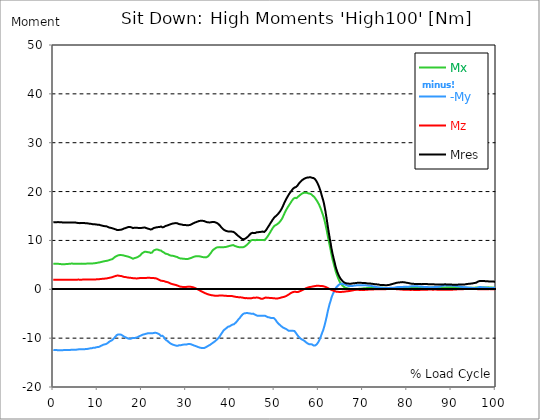
| Category |  Mx |  -My |  Mz |  Mres |
|---|---|---|---|---|
| 0.0 | 5.252 | -12.403 | 1.958 | 13.716 |
| 0.167348456675344 | 5.252 | -12.426 | 1.958 | 13.728 |
| 0.334696913350688 | 5.24 | -12.426 | 1.958 | 13.728 |
| 0.5020453700260321 | 5.228 | -12.438 | 1.958 | 13.728 |
| 0.669393826701376 | 5.228 | -12.426 | 1.958 | 13.716 |
| 0.83674228337672 | 5.228 | -12.438 | 1.958 | 13.728 |
| 1.0040907400520642 | 5.217 | -12.474 | 1.958 | 13.752 |
| 1.1621420602454444 | 5.193 | -12.474 | 1.958 | 13.752 |
| 1.3294905169207885 | 5.193 | -12.474 | 1.958 | 13.74 |
| 1.4968389735961325 | 5.181 | -12.474 | 1.958 | 13.74 |
| 1.6641874302714765 | 5.157 | -12.474 | 1.958 | 13.728 |
| 1.8315358869468206 | 5.121 | -12.474 | 1.958 | 13.716 |
| 1.9988843436221646 | 5.109 | -12.462 | 1.97 | 13.692 |
| 2.1662328002975086 | 5.109 | -12.45 | 1.97 | 13.68 |
| 2.333581256972853 | 5.133 | -12.45 | 1.97 | 13.68 |
| 2.5009297136481967 | 5.145 | -12.438 | 1.958 | 13.68 |
| 2.6682781703235405 | 5.145 | -12.426 | 1.958 | 13.668 |
| 2.8356266269988843 | 5.157 | -12.426 | 1.946 | 13.68 |
| 3.002975083674229 | 5.169 | -12.45 | 1.946 | 13.692 |
| 3.1703235403495724 | 5.193 | -12.438 | 1.946 | 13.692 |
| 3.337671997024917 | 5.193 | -12.426 | 1.958 | 13.692 |
| 3.4957233172182973 | 5.217 | -12.426 | 1.958 | 13.692 |
| 3.663071773893641 | 5.228 | -12.426 | 1.958 | 13.692 |
| 3.8304202305689854 | 5.24 | -12.415 | 1.958 | 13.68 |
| 3.997768687244329 | 5.252 | -12.391 | 1.97 | 13.68 |
| 4.165117143919673 | 5.264 | -12.379 | 1.97 | 13.668 |
| 4.332465600595017 | 5.252 | -12.367 | 1.97 | 13.656 |
| 4.499814057270361 | 5.252 | -12.367 | 1.97 | 13.644 |
| 4.667162513945706 | 5.24 | -12.379 | 1.97 | 13.656 |
| 4.834510970621049 | 5.24 | -12.379 | 1.97 | 13.656 |
| 5.001859427296393 | 5.228 | -12.379 | 1.97 | 13.656 |
| 5.169207883971737 | 5.217 | -12.379 | 1.97 | 13.644 |
| 5.336556340647081 | 5.217 | -12.343 | 1.97 | 13.608 |
| 5.503904797322425 | 5.205 | -12.307 | 1.982 | 13.584 |
| 5.671253253997769 | 5.205 | -12.295 | 1.982 | 13.561 |
| 5.82930457419115 | 5.205 | -12.283 | 1.97 | 13.549 |
| 5.996653030866494 | 5.205 | -12.271 | 1.97 | 13.537 |
| 6.164001487541838 | 5.24 | -12.271 | 1.97 | 13.549 |
| 6.331349944217181 | 5.252 | -12.283 | 1.97 | 13.572 |
| 6.498698400892526 | 5.252 | -12.295 | 1.982 | 13.584 |
| 6.66604685756787 | 5.24 | -12.283 | 1.982 | 13.561 |
| 6.833395314243213 | 5.24 | -12.271 | 1.982 | 13.549 |
| 7.000743770918558 | 5.24 | -12.283 | 1.982 | 13.561 |
| 7.168092227593902 | 5.228 | -12.259 | 1.982 | 13.537 |
| 7.335440684269246 | 5.24 | -12.212 | 1.982 | 13.501 |
| 7.50278914094459 | 5.252 | -12.2 | 1.982 | 13.489 |
| 7.6701375976199335 | 5.264 | -12.212 | 1.982 | 13.501 |
| 7.837486054295278 | 5.264 | -12.2 | 1.982 | 13.489 |
| 7.995537374488658 | 5.264 | -12.152 | 1.982 | 13.453 |
| 8.162885831164003 | 5.276 | -12.104 | 1.982 | 13.417 |
| 8.330234287839346 | 5.276 | -12.092 | 1.982 | 13.405 |
| 8.49758274451469 | 5.288 | -12.104 | 1.97 | 13.417 |
| 8.664931201190035 | 5.288 | -12.068 | 1.982 | 13.381 |
| 8.832279657865378 | 5.288 | -12.009 | 1.993 | 13.334 |
| 8.999628114540721 | 5.3 | -11.973 | 2.005 | 13.298 |
| 9.166976571216066 | 5.324 | -11.985 | 1.993 | 13.322 |
| 9.334325027891412 | 5.336 | -11.985 | 1.993 | 13.322 |
| 9.501673484566755 | 5.348 | -11.937 | 2.005 | 13.286 |
| 9.669021941242098 | 5.372 | -11.877 | 2.029 | 13.25 |
| 9.836370397917442 | 5.407 | -11.842 | 2.041 | 13.226 |
| 10.003718854592787 | 5.443 | -11.818 | 2.041 | 13.226 |
| 10.17106731126813 | 5.467 | -11.806 | 2.053 | 13.226 |
| 10.329118631461512 | 5.479 | -11.782 | 2.065 | 13.214 |
| 10.496467088136853 | 5.515 | -11.698 | 2.089 | 13.155 |
| 10.663815544812199 | 5.551 | -11.615 | 2.101 | 13.107 |
| 10.831164001487544 | 5.598 | -11.555 | 2.113 | 13.083 |
| 10.998512458162887 | 5.634 | -11.483 | 2.137 | 13.035 |
| 11.16586091483823 | 5.67 | -11.412 | 2.149 | 12.999 |
| 11.333209371513574 | 5.706 | -11.328 | 2.173 | 12.952 |
| 11.50055782818892 | 5.73 | -11.316 | 2.173 | 12.94 |
| 11.667906284864264 | 5.766 | -11.257 | 2.184 | 12.916 |
| 11.835254741539607 | 5.801 | -11.233 | 2.184 | 12.916 |
| 12.00260319821495 | 5.813 | -11.173 | 2.22 | 12.892 |
| 12.169951654890292 | 5.837 | -11.09 | 2.244 | 12.82 |
| 12.337300111565641 | 5.885 | -10.97 | 2.28 | 12.749 |
| 12.504648568240984 | 5.945 | -10.827 | 2.316 | 12.689 |
| 12.662699888434362 | 5.992 | -10.696 | 2.352 | 12.629 |
| 12.830048345109708 | 6.028 | -10.612 | 2.375 | 12.582 |
| 12.997396801785053 | 6.088 | -10.552 | 2.411 | 12.57 |
| 13.164745258460396 | 6.136 | -10.481 | 2.435 | 12.534 |
| 13.33209371513574 | 6.171 | -10.385 | 2.483 | 12.486 |
| 13.499442171811083 | 6.255 | -10.242 | 2.543 | 12.438 |
| 13.666790628486426 | 6.41 | -10.063 | 2.602 | 12.379 |
| 13.834139085161771 | 6.565 | -9.896 | 2.65 | 12.343 |
| 14.001487541837117 | 6.673 | -9.729 | 2.698 | 12.295 |
| 14.16883599851246 | 6.756 | -9.538 | 2.746 | 12.212 |
| 14.336184455187803 | 6.816 | -9.371 | 2.793 | 12.152 |
| 14.503532911863147 | 6.9 | -9.251 | 2.793 | 12.128 |
| 14.670881368538492 | 6.947 | -9.239 | 2.805 | 12.14 |
| 14.828932688731873 | 6.983 | -9.227 | 2.805 | 12.152 |
| 14.996281145407215 | 7.007 | -9.251 | 2.746 | 12.164 |
| 15.163629602082558 | 7.019 | -9.215 | 2.757 | 12.164 |
| 15.330978058757903 | 6.995 | -9.299 | 2.722 | 12.2 |
| 15.498326515433247 | 6.995 | -9.371 | 2.674 | 12.236 |
| 15.665674972108594 | 6.983 | -9.49 | 2.614 | 12.307 |
| 15.833023428783937 | 6.924 | -9.621 | 2.543 | 12.403 |
| 16.00037188545928 | 6.888 | -9.693 | 2.531 | 12.45 |
| 16.167720342134626 | 6.876 | -9.753 | 2.531 | 12.498 |
| 16.335068798809967 | 6.816 | -9.836 | 2.495 | 12.534 |
| 16.502417255485312 | 6.78 | -9.872 | 2.471 | 12.582 |
| 16.669765712160658 | 6.733 | -9.979 | 2.435 | 12.653 |
| 16.837114168836 | 6.685 | -10.063 | 2.411 | 12.713 |
| 17.004462625511344 | 6.661 | -10.099 | 2.387 | 12.761 |
| 17.16251394570472 | 6.613 | -10.158 | 2.364 | 12.808 |
| 17.32986240238007 | 6.542 | -10.135 | 2.352 | 12.761 |
| 17.497210859055414 | 6.47 | -10.111 | 2.34 | 12.713 |
| 17.664559315730756 | 6.398 | -10.075 | 2.328 | 12.665 |
| 17.8319077724061 | 6.267 | -9.979 | 2.28 | 12.522 |
| 17.999256229081443 | 6.255 | -9.944 | 2.268 | 12.522 |
| 18.166604685756788 | 6.303 | -9.967 | 2.268 | 12.558 |
| 18.333953142432133 | 6.374 | -9.979 | 2.244 | 12.594 |
| 18.501301599107478 | 6.422 | -9.932 | 2.244 | 12.606 |
| 18.668650055782823 | 6.47 | -9.908 | 2.232 | 12.594 |
| 18.835998512458165 | 6.506 | -9.884 | 2.208 | 12.594 |
| 19.00334696913351 | 6.565 | -9.824 | 2.232 | 12.582 |
| 19.170695425808855 | 6.661 | -9.741 | 2.256 | 12.558 |
| 19.338043882484197 | 6.756 | -9.645 | 2.28 | 12.534 |
| 19.496095202677576 | 6.864 | -9.538 | 2.304 | 12.51 |
| 19.66344365935292 | 6.959 | -9.514 | 2.292 | 12.534 |
| 19.830792116028263 | 7.138 | -9.442 | 2.316 | 12.558 |
| 19.998140572703612 | 7.329 | -9.371 | 2.328 | 12.57 |
| 20.165489029378953 | 7.425 | -9.311 | 2.328 | 12.594 |
| 20.3328374860543 | 7.52 | -9.251 | 2.316 | 12.617 |
| 20.500185942729644 | 7.628 | -9.203 | 2.328 | 12.641 |
| 20.667534399404985 | 7.676 | -9.18 | 2.328 | 12.641 |
| 20.83488285608033 | 7.687 | -9.144 | 2.34 | 12.594 |
| 21.002231312755672 | 7.664 | -9.096 | 2.328 | 12.534 |
| 21.16957976943102 | 7.64 | -9.036 | 2.34 | 12.474 |
| 21.336928226106362 | 7.604 | -9.012 | 2.352 | 12.426 |
| 21.504276682781704 | 7.592 | -9.001 | 2.352 | 12.403 |
| 21.67162513945705 | 7.568 | -8.989 | 2.352 | 12.343 |
| 21.82967645965043 | 7.496 | -8.989 | 2.34 | 12.283 |
| 21.997024916325774 | 7.437 | -8.977 | 2.328 | 12.236 |
| 22.16437337300112 | 7.425 | -8.977 | 2.328 | 12.224 |
| 22.33172182967646 | 7.532 | -9.012 | 2.304 | 12.307 |
| 22.499070286351806 | 7.711 | -9.001 | 2.292 | 12.415 |
| 22.666418743027148 | 7.926 | -8.953 | 2.292 | 12.534 |
| 22.833767199702496 | 8.01 | -8.905 | 2.304 | 12.57 |
| 23.00111565637784 | 8.069 | -8.893 | 2.268 | 12.606 |
| 23.168464113053183 | 8.117 | -8.917 | 2.232 | 12.641 |
| 23.335812569728528 | 8.153 | -8.941 | 2.196 | 12.677 |
| 23.50316102640387 | 8.153 | -8.989 | 2.137 | 12.713 |
| 23.670509483079215 | 8.105 | -9.084 | 2.041 | 12.725 |
| 23.83785793975456 | 8.046 | -9.096 | 1.982 | 12.689 |
| 23.995909259947936 | 7.974 | -9.239 | 1.91 | 12.737 |
| 24.163257716623285 | 7.974 | -9.442 | 1.826 | 12.832 |
| 24.330606173298627 | 7.926 | -9.55 | 1.755 | 12.856 |
| 24.49795462997397 | 7.819 | -9.502 | 1.731 | 12.761 |
| 24.665303086649313 | 7.687 | -9.514 | 1.719 | 12.677 |
| 24.83265154332466 | 7.592 | -9.609 | 1.707 | 12.677 |
| 25.0 | 7.532 | -9.8 | 1.683 | 12.761 |
| 25.167348456675345 | 7.401 | -10.111 | 1.6 | 12.88 |
| 25.334696913350694 | 7.294 | -10.29 | 1.552 | 12.952 |
| 25.502045370026035 | 7.27 | -10.421 | 1.516 | 13.011 |
| 25.669393826701377 | 7.234 | -10.481 | 1.492 | 13.035 |
| 25.836742283376722 | 7.186 | -10.588 | 1.444 | 13.083 |
| 26.004090740052067 | 7.126 | -10.719 | 1.397 | 13.143 |
| 26.17143919672741 | 7.031 | -10.875 | 1.325 | 13.202 |
| 26.329490516920792 | 6.947 | -11.018 | 1.241 | 13.262 |
| 26.49683897359613 | 6.912 | -11.101 | 1.17 | 13.322 |
| 26.66418743027148 | 6.888 | -11.185 | 1.122 | 13.37 |
| 26.831535886946828 | 6.864 | -11.257 | 1.086 | 13.417 |
| 26.998884343622166 | 6.852 | -11.328 | 1.039 | 13.465 |
| 27.166232800297514 | 6.828 | -11.376 | 1.003 | 13.501 |
| 27.333581256972852 | 6.78 | -11.424 | 0.955 | 13.501 |
| 27.5009297136482 | 6.721 | -11.472 | 0.919 | 13.525 |
| 27.668278170323543 | 6.685 | -11.519 | 0.883 | 13.549 |
| 27.835626626998888 | 6.661 | -11.543 | 0.848 | 13.549 |
| 28.002975083674233 | 6.601 | -11.543 | 0.788 | 13.525 |
| 28.170323540349575 | 6.518 | -11.543 | 0.728 | 13.477 |
| 28.33767199702492 | 6.422 | -11.472 | 0.657 | 13.37 |
| 28.50502045370026 | 6.362 | -11.436 | 0.597 | 13.31 |
| 28.663071773893645 | 6.327 | -11.436 | 0.549 | 13.298 |
| 28.830420230568986 | 6.327 | -11.436 | 0.525 | 13.298 |
| 28.99776868724433 | 6.303 | -11.412 | 0.513 | 13.262 |
| 29.165117143919673 | 6.267 | -11.364 | 0.477 | 13.202 |
| 29.33246560059502 | 6.243 | -11.328 | 0.466 | 13.167 |
| 29.499814057270367 | 6.231 | -11.316 | 0.454 | 13.155 |
| 29.66716251394571 | 6.231 | -11.304 | 0.454 | 13.143 |
| 29.834510970621054 | 6.207 | -11.304 | 0.466 | 13.143 |
| 30.00185942729639 | 6.183 | -11.292 | 0.477 | 13.131 |
| 30.169207883971744 | 6.183 | -11.281 | 0.489 | 13.131 |
| 30.33655634064708 | 6.195 | -11.245 | 0.513 | 13.131 |
| 30.50390479732243 | 6.243 | -11.209 | 0.537 | 13.119 |
| 30.671253253997772 | 6.279 | -11.185 | 0.549 | 13.131 |
| 30.829304574191156 | 6.327 | -11.197 | 0.537 | 13.167 |
| 30.996653030866494 | 6.374 | -11.209 | 0.525 | 13.202 |
| 31.164001487541842 | 6.434 | -11.269 | 0.501 | 13.274 |
| 31.331349944217187 | 6.482 | -11.328 | 0.466 | 13.346 |
| 31.498698400892525 | 6.553 | -11.388 | 0.43 | 13.441 |
| 31.666046857567874 | 6.625 | -11.46 | 0.382 | 13.525 |
| 31.833395314243212 | 6.697 | -11.519 | 0.334 | 13.608 |
| 32.00074377091856 | 6.721 | -11.567 | 0.263 | 13.656 |
| 32.1680922275939 | 6.756 | -11.615 | 0.191 | 13.716 |
| 32.33544068426925 | 6.768 | -11.674 | 0.119 | 13.763 |
| 32.50278914094459 | 6.744 | -11.734 | 0.036 | 13.823 |
| 32.670137597619934 | 6.756 | -11.794 | -0.036 | 13.883 |
| 32.83748605429528 | 6.756 | -11.854 | -0.119 | 13.943 |
| 33.004834510970625 | 6.756 | -11.913 | -0.191 | 13.99 |
| 33.162885831164004 | 6.721 | -11.949 | -0.275 | 14.002 |
| 33.33023428783935 | 6.685 | -11.973 | -0.346 | 14.014 |
| 33.497582744514695 | 6.649 | -12.009 | -0.43 | 14.026 |
| 33.664931201190036 | 6.613 | -12.021 | -0.501 | 14.014 |
| 33.83227965786538 | 6.589 | -12.021 | -0.585 | 14.002 |
| 33.99962811454073 | 6.553 | -12.021 | -0.657 | 13.99 |
| 34.16697657121607 | 6.53 | -11.997 | -0.728 | 13.954 |
| 34.33432502789141 | 6.53 | -11.913 | -0.8 | 13.871 |
| 34.50167348456676 | 6.53 | -11.842 | -0.859 | 13.799 |
| 34.6690219412421 | 6.577 | -11.758 | -0.931 | 13.752 |
| 34.83637039791744 | 6.649 | -11.674 | -0.991 | 13.728 |
| 35.00371885459279 | 6.756 | -11.591 | -1.039 | 13.704 |
| 35.17106731126814 | 6.924 | -11.495 | -1.086 | 13.68 |
| 35.338415767943474 | 7.114 | -11.4 | -1.122 | 13.68 |
| 35.49646708813686 | 7.317 | -11.328 | -1.158 | 13.716 |
| 35.6638155448122 | 7.508 | -11.209 | -1.194 | 13.716 |
| 35.831164001487544 | 7.735 | -11.101 | -1.218 | 13.752 |
| 35.998512458162885 | 7.95 | -10.994 | -1.241 | 13.787 |
| 36.165860914838234 | 8.117 | -10.887 | -1.265 | 13.811 |
| 36.333209371513576 | 8.213 | -10.791 | -1.289 | 13.775 |
| 36.50055782818892 | 8.272 | -10.672 | -1.301 | 13.716 |
| 36.667906284864266 | 8.416 | -10.54 | -1.325 | 13.692 |
| 36.83525474153961 | 8.523 | -10.409 | -1.325 | 13.644 |
| 37.002603198214956 | 8.571 | -10.266 | -1.325 | 13.561 |
| 37.1699516548903 | 8.619 | -10.123 | -1.325 | 13.477 |
| 37.337300111565646 | 8.619 | -9.956 | -1.301 | 13.346 |
| 37.50464856824098 | 8.619 | -9.776 | -1.277 | 13.202 |
| 37.66269988843437 | 8.631 | -9.562 | -1.265 | 13.047 |
| 37.83004834510971 | 8.607 | -9.311 | -1.265 | 12.844 |
| 37.99739680178505 | 8.595 | -9.072 | -1.265 | 12.653 |
| 38.16474525846039 | 8.619 | -8.857 | -1.265 | 12.498 |
| 38.33209371513574 | 8.619 | -8.631 | -1.289 | 12.343 |
| 38.49944217181109 | 8.607 | -8.416 | -1.301 | 12.188 |
| 38.666790628486424 | 8.631 | -8.296 | -1.313 | 12.116 |
| 38.83413908516178 | 8.654 | -8.153 | -1.325 | 12.033 |
| 39.001487541837115 | 8.666 | -8.022 | -1.337 | 11.961 |
| 39.16883599851246 | 8.678 | -7.926 | -1.349 | 11.913 |
| 39.336184455187805 | 8.738 | -7.783 | -1.361 | 11.877 |
| 39.503532911863154 | 8.798 | -7.652 | -1.373 | 11.842 |
| 39.670881368538495 | 8.833 | -7.556 | -1.373 | 11.818 |
| 39.83822982521384 | 8.905 | -7.592 | -1.373 | 11.901 |
| 39.996281145407224 | 8.917 | -7.508 | -1.373 | 11.854 |
| 40.163629602082565 | 8.953 | -7.401 | -1.361 | 11.818 |
| 40.33097805875791 | 9.001 | -7.317 | -1.373 | 11.806 |
| 40.498326515433256 | 9.036 | -7.234 | -1.397 | 11.794 |
| 40.6656749721086 | 9.048 | -7.174 | -1.444 | 11.758 |
| 40.83302342878393 | 9.001 | -7.15 | -1.48 | 11.71 |
| 41.00037188545929 | 8.893 | -7.091 | -1.504 | 11.591 |
| 41.16772034213463 | 8.821 | -6.888 | -1.552 | 11.424 |
| 41.33506879880997 | 8.774 | -6.744 | -1.564 | 11.304 |
| 41.50241725548531 | 8.726 | -6.577 | -1.576 | 11.173 |
| 41.66976571216066 | 8.678 | -6.374 | -1.6 | 11.018 |
| 41.837114168836 | 8.642 | -6.171 | -1.647 | 10.887 |
| 42.004462625511344 | 8.619 | -6.004 | -1.659 | 10.779 |
| 42.17181108218669 | 8.595 | -5.849 | -1.659 | 10.672 |
| 42.32986240238007 | 8.583 | -5.67 | -1.647 | 10.54 |
| 42.497210859055414 | 8.583 | -5.431 | -1.659 | 10.397 |
| 42.66455931573076 | 8.583 | -5.252 | -1.683 | 10.314 |
| 42.831907772406105 | 8.595 | -5.109 | -1.719 | 10.254 |
| 42.999256229081446 | 8.631 | -5.014 | -1.755 | 10.242 |
| 43.16660468575679 | 8.714 | -4.93 | -1.791 | 10.278 |
| 43.33395314243214 | 8.798 | -4.87 | -1.814 | 10.338 |
| 43.50130159910748 | 8.905 | -4.882 | -1.802 | 10.433 |
| 43.66865005578282 | 9.024 | -4.87 | -1.802 | 10.54 |
| 43.83599851245817 | 9.18 | -4.858 | -1.826 | 10.672 |
| 44.00334696913351 | 9.323 | -4.835 | -1.838 | 10.791 |
| 44.17069542580886 | 9.478 | -4.906 | -1.838 | 10.958 |
| 44.3380438824842 | 9.633 | -4.954 | -1.838 | 11.125 |
| 44.49609520267758 | 9.8 | -4.954 | -1.85 | 11.269 |
| 44.66344365935292 | 9.967 | -5.002 | -1.862 | 11.424 |
| 44.83079211602827 | 10.063 | -5.026 | -1.85 | 11.519 |
| 44.99814057270361 | 10.111 | -5.026 | -1.791 | 11.555 |
| 45.16548902937895 | 10.123 | -4.978 | -1.731 | 11.531 |
| 45.332837486054295 | 10.087 | -5.073 | -1.707 | 11.519 |
| 45.500185942729644 | 10.063 | -5.157 | -1.707 | 11.519 |
| 45.66753439940499 | 10.039 | -5.228 | -1.719 | 11.531 |
| 45.83488285608033 | 10.087 | -5.3 | -1.719 | 11.591 |
| 46.00223131275568 | 10.123 | -5.407 | -1.695 | 11.674 |
| 46.16957976943102 | 10.135 | -5.431 | -1.707 | 11.71 |
| 46.336928226106366 | 10.099 | -5.419 | -1.719 | 11.686 |
| 46.50427668278171 | 10.075 | -5.431 | -1.767 | 11.698 |
| 46.671625139457056 | 10.099 | -5.407 | -1.826 | 11.734 |
| 46.829676459650436 | 10.099 | -5.396 | -1.886 | 11.746 |
| 46.99702491632577 | 10.075 | -5.407 | -1.946 | 11.758 |
| 47.16437337300112 | 10.075 | -5.419 | -1.982 | 11.782 |
| 47.33172182967646 | 10.099 | -5.431 | -1.946 | 11.818 |
| 47.49907028635181 | 10.063 | -5.396 | -1.886 | 11.77 |
| 47.66641874302716 | 10.051 | -5.336 | -1.802 | 11.734 |
| 47.83376719970249 | 10.147 | -5.407 | -1.743 | 11.854 |
| 48.001115656377834 | 10.29 | -5.467 | -1.695 | 11.997 |
| 48.16846411305319 | 10.457 | -5.563 | -1.695 | 12.212 |
| 48.33581256972853 | 10.684 | -5.634 | -1.719 | 12.45 |
| 48.50316102640387 | 10.91 | -5.706 | -1.719 | 12.689 |
| 48.67050948307921 | 11.137 | -5.694 | -1.731 | 12.892 |
| 48.837857939754564 | 11.376 | -5.754 | -1.791 | 13.155 |
| 49.005206396429905 | 11.627 | -5.825 | -1.791 | 13.417 |
| 49.163257716623285 | 11.889 | -5.861 | -1.779 | 13.656 |
| 49.33060617329863 | 12.14 | -5.849 | -1.779 | 13.871 |
| 49.49795462997397 | 12.403 | -5.861 | -1.802 | 14.133 |
| 49.66530308664932 | 12.629 | -5.861 | -1.826 | 14.348 |
| 49.832651543324666 | 12.82 | -5.885 | -1.838 | 14.539 |
| 50.0 | 12.999 | -5.992 | -1.85 | 14.754 |
| 50.16734845667534 | 13.095 | -6.171 | -1.862 | 14.897 |
| 50.33469691335069 | 13.167 | -6.374 | -1.886 | 14.993 |
| 50.50204537002604 | 13.25 | -6.613 | -1.886 | 15.136 |
| 50.66939382670139 | 13.358 | -6.816 | -1.874 | 15.291 |
| 50.836742283376715 | 13.477 | -6.983 | -1.838 | 15.47 |
| 51.00409074005207 | 13.608 | -7.126 | -1.814 | 15.638 |
| 51.17143919672741 | 13.763 | -7.258 | -1.779 | 15.829 |
| 51.32949051692079 | 13.954 | -7.401 | -1.743 | 16.055 |
| 51.496838973596134 | 14.157 | -7.532 | -1.695 | 16.294 |
| 51.66418743027148 | 14.396 | -7.664 | -1.647 | 16.557 |
| 51.831535886946824 | 14.671 | -7.771 | -1.612 | 16.867 |
| 51.99888434362217 | 15.017 | -7.89 | -1.588 | 17.225 |
| 52.16623280029752 | 15.351 | -7.926 | -1.552 | 17.559 |
| 52.33358125697285 | 15.697 | -7.998 | -1.504 | 17.906 |
| 52.5009297136482 | 16.008 | -8.069 | -1.444 | 18.204 |
| 52.668278170323546 | 16.282 | -8.129 | -1.361 | 18.491 |
| 52.835626626998895 | 16.545 | -8.249 | -1.277 | 18.765 |
| 53.00297508367424 | 16.795 | -8.356 | -1.194 | 19.028 |
| 53.17032354034958 | 17.034 | -8.475 | -1.098 | 19.29 |
| 53.33767199702492 | 17.273 | -8.535 | -1.003 | 19.541 |
| 53.50502045370027 | 17.5 | -8.499 | -0.883 | 19.732 |
| 53.663071773893655 | 17.727 | -8.499 | -0.788 | 19.947 |
| 53.83042023056899 | 17.977 | -8.499 | -0.704 | 20.162 |
| 53.99776868724433 | 18.204 | -8.499 | -0.633 | 20.365 |
| 54.16511714391967 | 18.395 | -8.499 | -0.585 | 20.556 |
| 54.33246560059503 | 18.574 | -8.499 | -0.537 | 20.699 |
| 54.49981405727037 | 18.693 | -8.535 | -0.501 | 20.818 |
| 54.667162513945705 | 18.717 | -8.666 | -0.489 | 20.866 |
| 54.834510970621054 | 18.67 | -8.929 | -0.525 | 20.914 |
| 55.0018594272964 | 18.658 | -9.144 | -0.561 | 20.985 |
| 55.169207883971744 | 18.777 | -9.371 | -0.561 | 21.188 |
| 55.336556340647086 | 18.944 | -9.574 | -0.549 | 21.415 |
| 55.50390479732243 | 19.087 | -9.741 | -0.501 | 21.63 |
| 55.671253253997776 | 19.207 | -9.896 | -0.43 | 21.809 |
| 55.83860171067312 | 19.338 | -10.039 | -0.37 | 21.976 |
| 55.9966530308665 | 19.445 | -10.111 | -0.298 | 22.131 |
| 56.16400148754184 | 19.553 | -10.266 | -0.227 | 22.287 |
| 56.33134994421718 | 19.648 | -10.326 | -0.155 | 22.406 |
| 56.498698400892536 | 19.696 | -10.397 | -0.072 | 22.501 |
| 56.66604685756788 | 19.744 | -10.481 | 0.012 | 22.597 |
| 56.83339531424321 | 19.768 | -10.612 | 0.084 | 22.68 |
| 57.00074377091856 | 19.78 | -10.767 | 0.155 | 22.764 |
| 57.16809222759391 | 19.756 | -10.875 | 0.227 | 22.812 |
| 57.33544068426925 | 19.732 | -10.97 | 0.286 | 22.848 |
| 57.5027891409446 | 19.684 | -11.09 | 0.346 | 22.883 |
| 57.670137597619934 | 19.625 | -11.209 | 0.394 | 22.907 |
| 57.83748605429528 | 19.577 | -11.245 | 0.442 | 22.907 |
| 58.004834510970625 | 19.565 | -11.185 | 0.466 | 22.919 |
| 58.16288583116401 | 19.529 | -11.233 | 0.489 | 22.931 |
| 58.330234287839346 | 19.434 | -11.292 | 0.513 | 22.907 |
| 58.497582744514695 | 19.29 | -11.292 | 0.549 | 22.812 |
| 58.66493120119004 | 19.147 | -11.436 | 0.573 | 22.8 |
| 58.832279657865385 | 19.004 | -11.519 | 0.597 | 22.764 |
| 58.999628114540734 | 18.873 | -11.555 | 0.633 | 22.692 |
| 59.16697657121607 | 18.682 | -11.507 | 0.657 | 22.537 |
| 59.33432502789142 | 18.467 | -11.424 | 0.692 | 22.334 |
| 59.50167348456676 | 18.24 | -11.316 | 0.716 | 22.096 |
| 59.66902194124211 | 18.001 | -11.137 | 0.716 | 21.833 |
| 59.83637039791745 | 17.738 | -10.91 | 0.716 | 21.511 |
| 60.00371885459278 | 17.452 | -10.648 | 0.704 | 21.152 |
| 60.17106731126813 | 17.142 | -10.349 | 0.692 | 20.759 |
| 60.33841576794349 | 16.784 | -9.991 | 0.692 | 20.317 |
| 60.49646708813685 | 16.402 | -9.597 | 0.68 | 19.804 |
| 60.6638155448122 | 15.972 | -9.168 | 0.668 | 19.255 |
| 60.831164001487544 | 15.53 | -8.75 | 0.657 | 18.717 |
| 60.99851245816289 | 15.112 | -8.392 | 0.633 | 18.252 |
| 61.16586091483824 | 14.587 | -7.89 | 0.597 | 17.607 |
| 61.333209371513576 | 13.99 | -7.341 | 0.549 | 16.867 |
| 61.50055782818892 | 13.358 | -6.756 | 0.501 | 16.055 |
| 61.667906284864266 | 12.665 | -6.1 | 0.442 | 15.124 |
| 61.835254741539615 | 11.937 | -5.443 | 0.37 | 14.181 |
| 62.002603198214956 | 11.149 | -4.715 | 0.286 | 13.167 |
| 62.16995165489029 | 10.385 | -4.059 | 0.203 | 12.2 |
| 62.33730011156564 | 9.621 | -3.45 | 0.119 | 11.281 |
| 62.504648568240995 | 8.881 | -2.889 | 0.036 | 10.397 |
| 62.67199702491633 | 8.177 | -2.435 | -0.036 | 9.609 |
| 62.83004834510971 | 7.341 | -1.85 | -0.107 | 8.619 |
| 62.99739680178505 | 6.637 | -1.409 | -0.167 | 7.819 |
| 63.1647452584604 | 6.004 | -1.039 | -0.227 | 7.114 |
| 63.33209371513575 | 5.419 | -0.74 | -0.286 | 6.482 |
| 63.4994421718111 | 4.835 | -0.394 | -0.346 | 5.837 |
| 63.666790628486424 | 4.273 | -0.119 | -0.394 | 5.228 |
| 63.83413908516177 | 3.689 | 0.191 | -0.442 | 4.596 |
| 64.00148754183712 | 3.223 | 0.43 | -0.489 | 4.094 |
| 64.16883599851248 | 2.805 | 0.597 | -0.513 | 3.653 |
| 64.3361844551878 | 2.399 | 0.728 | -0.525 | 3.235 |
| 64.50353291186315 | 2.053 | 0.848 | -0.537 | 2.901 |
| 64.6708813685385 | 1.695 | 1.015 | -0.537 | 2.59 |
| 64.83822982521384 | 1.421 | 1.05 | -0.549 | 2.328 |
| 65.00557828188919 | 1.17 | 1.11 | -0.537 | 2.101 |
| 65.16362960208257 | 0.967 | 1.122 | -0.537 | 1.898 |
| 65.3309780587579 | 0.788 | 1.122 | -0.525 | 1.719 |
| 65.49832651543326 | 0.645 | 1.074 | -0.513 | 1.576 |
| 65.6656749721086 | 0.513 | 1.027 | -0.501 | 1.456 |
| 65.83302342878395 | 0.406 | 0.991 | -0.477 | 1.361 |
| 66.00037188545929 | 0.322 | 0.943 | -0.454 | 1.289 |
| 66.16772034213463 | 0.275 | 0.883 | -0.442 | 1.241 |
| 66.33506879880998 | 0.227 | 0.812 | -0.418 | 1.194 |
| 66.50241725548531 | 0.191 | 0.74 | -0.406 | 1.194 |
| 66.66976571216065 | 0.155 | 0.692 | -0.382 | 1.17 |
| 66.83711416883601 | 0.119 | 0.668 | -0.358 | 1.158 |
| 67.00446262551135 | 0.095 | 0.645 | -0.346 | 1.134 |
| 67.1718110821867 | 0.048 | 0.657 | -0.31 | 1.146 |
| 67.32986240238007 | 0.024 | 0.668 | -0.286 | 1.146 |
| 67.49721085905541 | 0.012 | 0.692 | -0.251 | 1.17 |
| 67.66455931573076 | 0.012 | 0.68 | -0.227 | 1.206 |
| 67.83190777240611 | 0.024 | 0.692 | -0.203 | 1.218 |
| 67.99925622908145 | 0.012 | 0.752 | -0.167 | 1.241 |
| 68.16660468575678 | 0 | 0.764 | -0.143 | 1.253 |
| 68.33395314243214 | 0 | 0.788 | -0.119 | 1.265 |
| 68.50130159910749 | 0.024 | 0.824 | -0.107 | 1.289 |
| 68.66865005578282 | 0.036 | 0.824 | -0.095 | 1.313 |
| 68.83599851245816 | 0.06 | 0.812 | -0.107 | 1.337 |
| 69.00334696913352 | 0.084 | 0.836 | -0.119 | 1.349 |
| 69.17069542580886 | 0.107 | 0.836 | -0.131 | 1.349 |
| 69.3380438824842 | 0.107 | 0.848 | -0.131 | 1.325 |
| 69.50539233915956 | 0.107 | 0.859 | -0.119 | 1.325 |
| 69.66344365935292 | 0.131 | 0.848 | -0.119 | 1.313 |
| 69.83079211602826 | 0.167 | 0.824 | -0.131 | 1.313 |
| 69.99814057270362 | 0.179 | 0.824 | -0.143 | 1.301 |
| 70.16548902937896 | 0.203 | 0.836 | -0.155 | 1.301 |
| 70.33283748605429 | 0.203 | 0.848 | -0.131 | 1.301 |
| 70.50018594272964 | 0.203 | 0.848 | -0.119 | 1.277 |
| 70.667534399405 | 0.227 | 0.812 | -0.095 | 1.253 |
| 70.83488285608033 | 0.251 | 0.776 | -0.095 | 1.218 |
| 71.00223131275568 | 0.263 | 0.764 | -0.084 | 1.206 |
| 71.16957976943102 | 0.251 | 0.74 | -0.06 | 1.182 |
| 71.33692822610637 | 0.275 | 0.704 | -0.06 | 1.17 |
| 71.50427668278171 | 0.298 | 0.716 | -0.06 | 1.182 |
| 71.67162513945706 | 0.31 | 0.728 | -0.048 | 1.182 |
| 71.8389735961324 | 0.31 | 0.704 | -0.048 | 1.17 |
| 71.99702491632577 | 0.322 | 0.657 | -0.036 | 1.122 |
| 72.16437337300113 | 0.322 | 0.609 | -0.036 | 1.098 |
| 72.33172182967647 | 0.322 | 0.597 | -0.024 | 1.098 |
| 72.49907028635181 | 0.322 | 0.561 | -0.012 | 1.062 |
| 72.66641874302715 | 0.334 | 0.525 | -0.012 | 1.039 |
| 72.8337671997025 | 0.334 | 0.513 | 0 | 1.027 |
| 73.00111565637783 | 0.334 | 0.477 | 0 | 1.015 |
| 73.16846411305319 | 0.334 | 0.442 | 0 | 1.003 |
| 73.33581256972853 | 0.334 | 0.406 | 0 | 0.991 |
| 73.50316102640387 | 0.334 | 0.382 | 0 | 0.967 |
| 73.67050948307921 | 0.322 | 0.37 | 0.012 | 0.943 |
| 73.83785793975457 | 0.31 | 0.346 | 0.012 | 0.895 |
| 74.00520639642991 | 0.31 | 0.322 | 0.012 | 0.871 |
| 74.16325771662328 | 0.31 | 0.298 | 0.012 | 0.859 |
| 74.33060617329863 | 0.31 | 0.298 | 0.012 | 0.859 |
| 74.49795462997398 | 0.322 | 0.286 | 0.012 | 0.871 |
| 74.66530308664932 | 0.31 | 0.286 | 0.024 | 0.859 |
| 74.83265154332466 | 0.298 | 0.286 | 0.024 | 0.848 |
| 75.00000000000001 | 0.286 | 0.286 | 0.024 | 0.848 |
| 75.16734845667534 | 0.275 | 0.275 | 0.024 | 0.836 |
| 75.3346969133507 | 0.275 | 0.275 | 0.036 | 0.824 |
| 75.50204537002605 | 0.275 | 0.239 | 0.036 | 0.824 |
| 75.66939382670138 | 0.263 | 0.286 | 0.048 | 0.871 |
| 75.83674228337672 | 0.275 | 0.298 | 0.048 | 0.895 |
| 76.00409074005208 | 0.275 | 0.286 | 0.048 | 0.907 |
| 76.17143919672742 | 0.275 | 0.298 | 0.048 | 0.955 |
| 76.33878765340276 | 0.286 | 0.334 | 0.036 | 1.003 |
| 76.49683897359614 | 0.286 | 0.298 | 0.036 | 1.05 |
| 76.66418743027148 | 0.263 | 0.286 | 0.048 | 1.086 |
| 76.83153588694682 | 0.263 | 0.298 | 0.06 | 1.122 |
| 76.99888434362218 | 0.275 | 0.298 | 0.048 | 1.17 |
| 77.16623280029752 | 0.286 | 0.334 | 0.036 | 1.23 |
| 77.33358125697285 | 0.275 | 0.382 | 0.048 | 1.253 |
| 77.5009297136482 | 0.298 | 0.406 | 0.024 | 1.301 |
| 77.66827817032356 | 0.31 | 0.43 | 0.012 | 1.349 |
| 77.83562662699889 | 0.31 | 0.442 | 0 | 1.373 |
| 78.00297508367423 | 0.31 | 0.466 | 0 | 1.373 |
| 78.17032354034959 | 0.31 | 0.489 | 0 | 1.373 |
| 78.33767199702493 | 0.346 | 0.466 | -0.024 | 1.409 |
| 78.50502045370027 | 0.37 | 0.477 | -0.048 | 1.444 |
| 78.67236891037561 | 0.358 | 0.489 | -0.048 | 1.444 |
| 78.83042023056899 | 0.346 | 0.489 | -0.06 | 1.444 |
| 78.99776868724433 | 0.37 | 0.489 | -0.072 | 1.468 |
| 79.16511714391969 | 0.382 | 0.513 | -0.084 | 1.456 |
| 79.33246560059503 | 0.382 | 0.501 | -0.084 | 1.432 |
| 79.49981405727036 | 0.382 | 0.513 | -0.084 | 1.397 |
| 79.66716251394571 | 0.382 | 0.513 | -0.084 | 1.373 |
| 79.83451097062107 | 0.358 | 0.489 | -0.084 | 1.337 |
| 80.00185942729641 | 0.358 | 0.489 | -0.084 | 1.325 |
| 80.16920788397174 | 0.37 | 0.501 | -0.095 | 1.289 |
| 80.33655634064709 | 0.382 | 0.513 | -0.095 | 1.265 |
| 80.50390479732243 | 0.382 | 0.573 | -0.119 | 1.206 |
| 80.67125325399778 | 0.382 | 0.573 | -0.131 | 1.194 |
| 80.83860171067312 | 0.37 | 0.609 | -0.131 | 1.17 |
| 80.99665303086651 | 0.346 | 0.621 | -0.119 | 1.146 |
| 81.16400148754184 | 0.346 | 0.621 | -0.131 | 1.146 |
| 81.3313499442172 | 0.322 | 0.621 | -0.119 | 1.122 |
| 81.49869840089255 | 0.334 | 0.621 | -0.131 | 1.11 |
| 81.66604685756786 | 0.334 | 0.633 | -0.131 | 1.098 |
| 81.83339531424322 | 0.358 | 0.633 | -0.143 | 1.11 |
| 82.00074377091858 | 0.346 | 0.645 | -0.131 | 1.098 |
| 82.16809222759392 | 0.334 | 0.657 | -0.131 | 1.098 |
| 82.33544068426926 | 0.334 | 0.621 | -0.131 | 1.098 |
| 82.50278914094459 | 0.334 | 0.597 | -0.131 | 1.086 |
| 82.67013759761994 | 0.346 | 0.561 | -0.131 | 1.086 |
| 82.83748605429528 | 0.346 | 0.561 | -0.119 | 1.086 |
| 83.00483451097062 | 0.322 | 0.561 | -0.119 | 1.074 |
| 83.17218296764597 | 0.334 | 0.549 | -0.107 | 1.062 |
| 83.33023428783935 | 0.346 | 0.525 | -0.107 | 1.05 |
| 83.4975827445147 | 0.322 | 0.525 | -0.095 | 1.086 |
| 83.66493120119004 | 0.346 | 0.501 | -0.107 | 1.098 |
| 83.83227965786537 | 0.358 | 0.477 | -0.107 | 1.11 |
| 83.99962811454073 | 0.37 | 0.466 | -0.107 | 1.098 |
| 84.16697657121607 | 0.37 | 0.466 | -0.095 | 1.086 |
| 84.33432502789142 | 0.358 | 0.454 | -0.095 | 1.086 |
| 84.50167348456677 | 0.358 | 0.454 | -0.084 | 1.062 |
| 84.6690219412421 | 0.346 | 0.442 | -0.072 | 1.05 |
| 84.83637039791745 | 0.334 | 0.43 | -0.06 | 1.027 |
| 85.0037188545928 | 0.334 | 0.418 | -0.06 | 1.027 |
| 85.17106731126813 | 0.334 | 0.418 | -0.048 | 1.027 |
| 85.33841576794349 | 0.334 | 0.43 | -0.048 | 1.027 |
| 85.50576422461883 | 0.346 | 0.43 | -0.06 | 1.027 |
| 85.66381554481221 | 0.346 | 0.418 | -0.072 | 1.027 |
| 85.83116400148755 | 0.358 | 0.418 | -0.072 | 1.039 |
| 85.99851245816289 | 0.346 | 0.442 | -0.072 | 1.027 |
| 86.16586091483823 | 0.346 | 0.466 | -0.072 | 1.003 |
| 86.33320937151358 | 0.334 | 0.489 | -0.06 | 0.979 |
| 86.50055782818893 | 0.358 | 0.477 | -0.072 | 0.967 |
| 86.66790628486427 | 0.37 | 0.466 | -0.072 | 0.967 |
| 86.83525474153961 | 0.382 | 0.477 | -0.084 | 0.967 |
| 87.00260319821496 | 0.382 | 0.501 | -0.084 | 0.967 |
| 87.16995165489031 | 0.358 | 0.525 | -0.072 | 0.967 |
| 87.33730011156564 | 0.358 | 0.537 | -0.072 | 0.967 |
| 87.504648568241 | 0.37 | 0.573 | -0.072 | 0.979 |
| 87.67199702491634 | 0.37 | 0.621 | -0.072 | 0.979 |
| 87.83004834510972 | 0.37 | 0.68 | -0.072 | 0.967 |
| 87.99739680178506 | 0.37 | 0.728 | -0.084 | 0.991 |
| 88.1647452584604 | 0.37 | 0.752 | -0.072 | 1.003 |
| 88.33209371513574 | 0.37 | 0.764 | -0.072 | 1.003 |
| 88.49944217181108 | 0.382 | 0.8 | -0.084 | 1.015 |
| 88.66679062848644 | 0.382 | 0.8 | -0.084 | 1.015 |
| 88.83413908516178 | 0.382 | 0.788 | -0.084 | 0.991 |
| 89.00148754183712 | 0.406 | 0.764 | -0.084 | 0.967 |
| 89.16883599851246 | 0.418 | 0.764 | -0.095 | 0.967 |
| 89.33618445518782 | 0.418 | 0.776 | -0.095 | 0.967 |
| 89.50353291186315 | 0.418 | 0.788 | -0.084 | 0.967 |
| 89.6708813685385 | 0.418 | 0.788 | -0.084 | 0.967 |
| 89.83822982521386 | 0.43 | 0.788 | -0.084 | 0.967 |
| 90.00557828188919 | 0.43 | 0.776 | -0.084 | 0.967 |
| 90.16362960208257 | 0.442 | 0.752 | -0.084 | 0.955 |
| 90.3309780587579 | 0.43 | 0.728 | -0.072 | 0.931 |
| 90.49832651543326 | 0.418 | 0.716 | -0.072 | 0.907 |
| 90.66567497210859 | 0.406 | 0.716 | -0.06 | 0.907 |
| 90.83302342878395 | 0.406 | 0.704 | -0.06 | 0.895 |
| 91.00037188545929 | 0.406 | 0.68 | -0.048 | 0.907 |
| 91.16772034213463 | 0.394 | 0.645 | -0.024 | 0.919 |
| 91.33506879880998 | 0.382 | 0.621 | -0.012 | 0.943 |
| 91.50241725548533 | 0.37 | 0.621 | -0.012 | 0.967 |
| 91.66976571216065 | 0.346 | 0.609 | 0 | 0.967 |
| 91.83711416883601 | 0.334 | 0.585 | 0.012 | 0.967 |
| 92.00446262551137 | 0.334 | 0.549 | 0.012 | 0.967 |
| 92.1718110821867 | 0.346 | 0.513 | 0.012 | 0.979 |
| 92.33915953886203 | 0.322 | 0.501 | 0.024 | 0.967 |
| 92.49721085905541 | 0.322 | 0.466 | 0.024 | 0.955 |
| 92.66455931573077 | 0.322 | 0.442 | 0.024 | 0.967 |
| 92.83190777240611 | 0.322 | 0.43 | 0.036 | 0.979 |
| 92.99925622908145 | 0.322 | 0.43 | 0.048 | 0.991 |
| 93.1666046857568 | 0.31 | 0.418 | 0.06 | 1.015 |
| 93.33395314243214 | 0.31 | 0.406 | 0.06 | 1.05 |
| 93.50130159910749 | 0.31 | 0.37 | 0.06 | 1.074 |
| 93.66865005578283 | 0.322 | 0.346 | 0.048 | 1.086 |
| 93.83599851245818 | 0.322 | 0.322 | 0.036 | 1.11 |
| 94.00334696913353 | 0.322 | 0.334 | 0.048 | 1.134 |
| 94.17069542580886 | 0.334 | 0.334 | 0.048 | 1.146 |
| 94.3380438824842 | 0.334 | 0.334 | 0.06 | 1.158 |
| 94.50539233915954 | 0.334 | 0.31 | 0.06 | 1.17 |
| 94.66344365935292 | 0.334 | 0.275 | 0.072 | 1.182 |
| 94.83079211602828 | 0.346 | 0.239 | 0.06 | 1.218 |
| 94.99814057270362 | 0.334 | 0.239 | 0.06 | 1.253 |
| 95.16548902937897 | 0.334 | 0.263 | 0.06 | 1.277 |
| 95.33283748605432 | 0.334 | 0.251 | 0.06 | 1.301 |
| 95.50018594272963 | 0.346 | 0.215 | 0.06 | 1.325 |
| 95.66753439940499 | 0.358 | 0.191 | 0.048 | 1.373 |
| 95.83488285608034 | 0.358 | 0.286 | 0.036 | 1.468 |
| 96.00223131275567 | 0.358 | 0.37 | 0.024 | 1.576 |
| 96.16957976943102 | 0.37 | 0.43 | 0.012 | 1.647 |
| 96.33692822610638 | 0.37 | 0.454 | 0 | 1.671 |
| 96.50427668278171 | 0.37 | 0.454 | 0 | 1.695 |
| 96.67162513945706 | 0.37 | 0.454 | 0.012 | 1.683 |
| 96.8389735961324 | 0.37 | 0.43 | 0.012 | 1.671 |
| 96.99702491632577 | 0.382 | 0.394 | 0 | 1.683 |
| 97.16437337300111 | 0.394 | 0.37 | -0.012 | 1.695 |
| 97.33172182967647 | 0.394 | 0.382 | -0.012 | 1.695 |
| 97.49907028635181 | 0.382 | 0.37 | 0 | 1.659 |
| 97.66641874302715 | 0.382 | 0.37 | 0 | 1.659 |
| 97.8337671997025 | 0.382 | 0.358 | 0.012 | 1.647 |
| 98.00111565637785 | 0.382 | 0.334 | 0.012 | 1.635 |
| 98.16846411305319 | 0.394 | 0.322 | 0 | 1.635 |
| 98.33581256972855 | 0.394 | 0.286 | 0.012 | 1.623 |
| 98.50316102640389 | 0.382 | 0.275 | 0.024 | 1.588 |
| 98.67050948307921 | 0.346 | 0.286 | 0.036 | 1.576 |
| 98.83785793975456 | 0.358 | 0.275 | 0.024 | 1.564 |
| 99.0052063964299 | 0.358 | 0.263 | 0.024 | 1.576 |
| 99.17255485310525 | 0.334 | 0.275 | 0.024 | 1.588 |
| 99.33060617329863 | 0.334 | 0.286 | 0.012 | 1.588 |
| 99.49795462997399 | 0.322 | 0.31 | 0.024 | 1.576 |
| 99.66530308664933 | 0.322 | 0.322 | 0.024 | 1.564 |
| 99.83265154332467 | 0.322 | 0.31 | 0.012 | 1.564 |
| 100.0 | 0.346 | 0.298 | 0.012 | 1.564 |